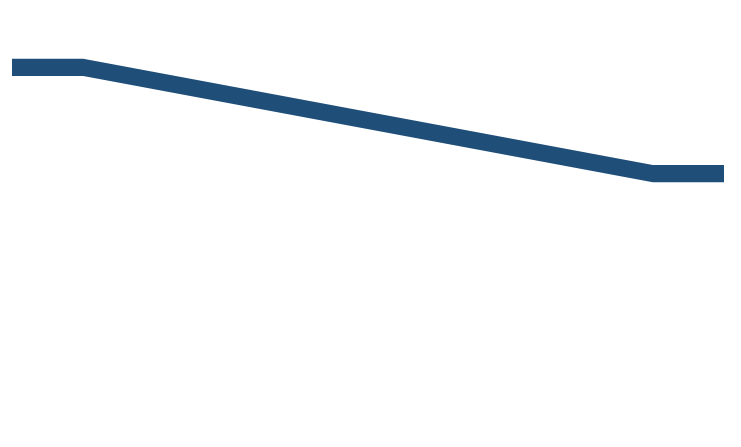
| Category | Series 0 | Series 1 | Series 2 |
|---|---|---|---|
| 0.0 | 562.448 | 164.583 | 3286.13 |
| 10.0 | 562.448 | 164.583 | 3286.13 |
| 90.0 | 1579.854 | 164.583 | 2268.724 |
| 100.0 | 1579.854 | 164.583 | 2268.724 |